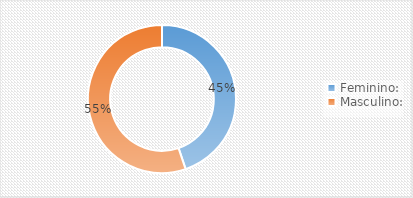
| Category | Series 0 |
|---|---|
| Feminino: | 13 |
| Masculino: | 16 |